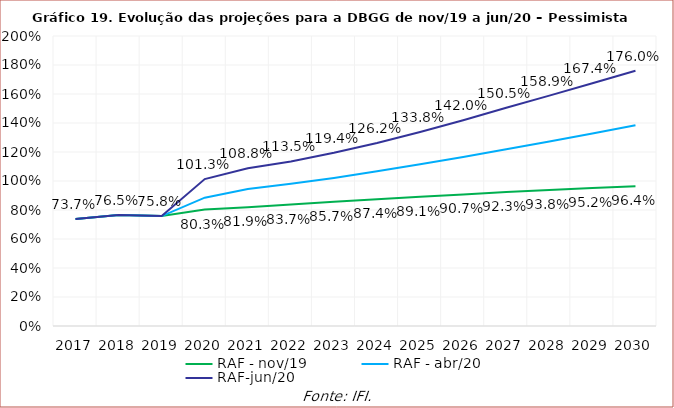
| Category | RAF - nov/19 | RAF - abr/20 | RAF-jun/20 |
|---|---|---|---|
| 2017.0 | 0.737 | 0.737 | 0.737 |
| 2018.0 | 0.765 | 0.765 | 0.765 |
| 2019.0 | 0.758 | 0.758 | 0.758 |
| 2020.0 | 0.803 | 0.885 | 1.013 |
| 2021.0 | 0.819 | 0.944 | 1.088 |
| 2022.0 | 0.837 | 0.981 | 1.135 |
| 2023.0 | 0.857 | 1.021 | 1.194 |
| 2024.0 | 0.874 | 1.067 | 1.262 |
| 2025.0 | 0.891 | 1.115 | 1.338 |
| 2026.0 | 0.907 | 1.166 | 1.42 |
| 2027.0 | 0.923 | 1.219 | 1.505 |
| 2028.0 | 0.938 | 1.273 | 1.589 |
| 2029.0 | 0.952 | 1.328 | 1.674 |
| 2030.0 | 0.964 | 1.385 | 1.76 |